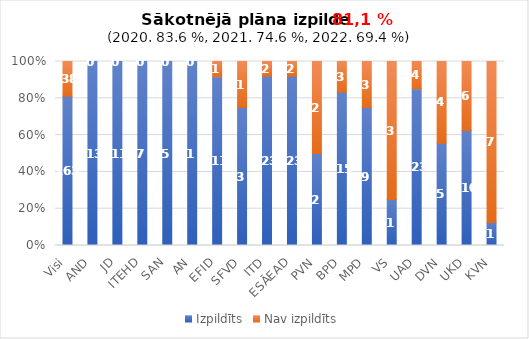
| Category | Izpildīts | Nav izpildīts |
|---|---|---|
| Visi | 163 | 38 |
| AND | 13 | 0 |
| JD | 11 | 0 |
| ITEHD | 7 | 0 |
| SAN | 5 | 0 |
| AN | 1 | 0 |
| EFID | 11 | 1 |
| SFVD | 3 | 1 |
| ITD | 23 | 2 |
| ESĀEAD | 23 | 2 |
| PVN | 2 | 2 |
| BPD | 15 | 3 |
| MPD | 9 | 3 |
| VS | 1 | 3 |
| UAD | 23 | 4 |
| DVN | 5 | 4 |
| UKD | 10 | 6 |
| KVN | 1 | 7 |